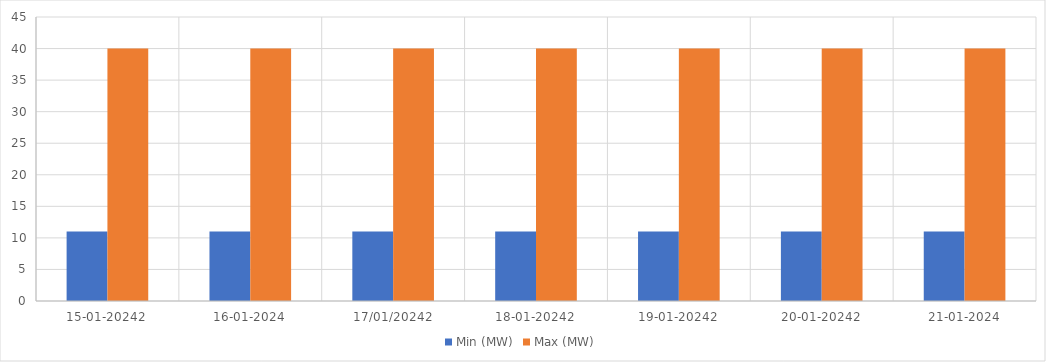
| Category | Min (MW) | Max (MW) |
|---|---|---|
| 15-01-20242 | 11 | 40 |
| 16-01-2024 | 11 | 40 |
| 17/01/20242 | 11 | 40 |
| 18-01-20242 | 11 | 40 |
| 19-01-20242 | 11 | 40 |
| 20-01-20242 | 11 | 40 |
| 21-01-2024 | 11 | 40 |